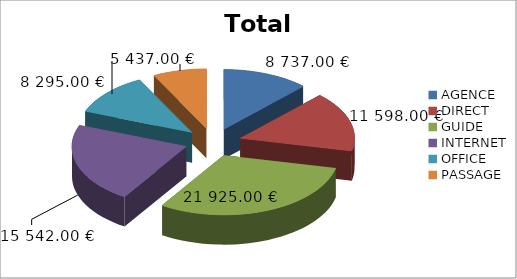
| Category | Total |
|---|---|
| AGENCE | 8737 |
| DIRECT | 11598 |
| GUIDE | 21925 |
| INTERNET | 15542 |
| OFFICE | 8295 |
| PASSAGE | 5437 |